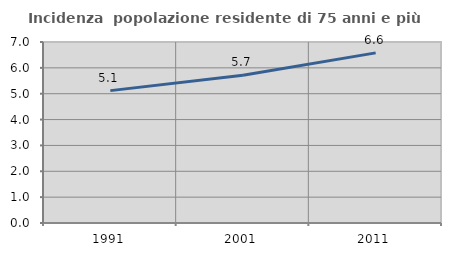
| Category | Incidenza  popolazione residente di 75 anni e più |
|---|---|
| 1991.0 | 5.119 |
| 2001.0 | 5.715 |
| 2011.0 | 6.579 |